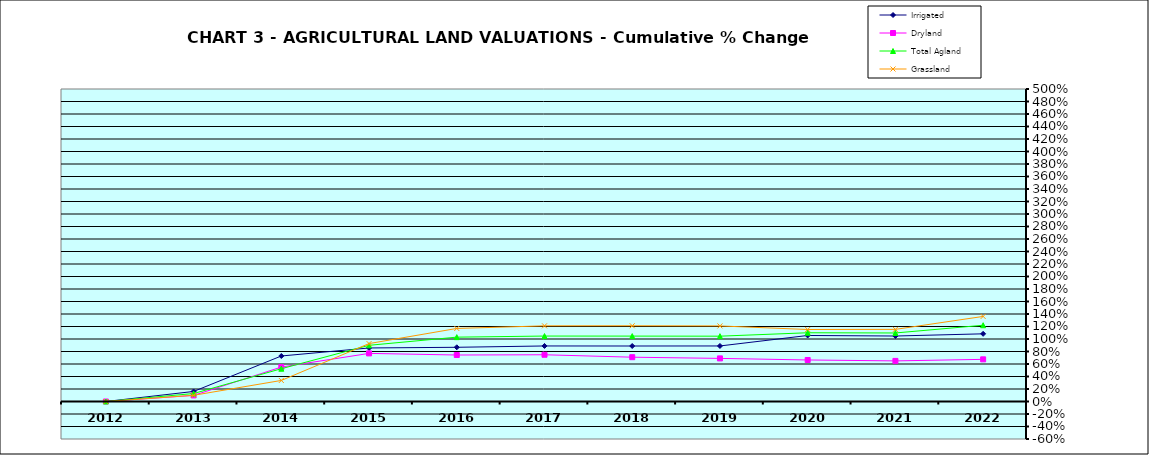
| Category | Irrigated | Dryland | Total Agland | Grassland |
|---|---|---|---|---|
| 2012.0 | 0 | 0 | 0 | 0 |
| 2013.0 | 0.161 | 0.098 | 0.128 | 0.099 |
| 2014.0 | 0.728 | 0.551 | 0.524 | 0.337 |
| 2015.0 | 0.857 | 0.77 | 0.899 | 0.927 |
| 2016.0 | 0.867 | 0.744 | 1.03 | 1.169 |
| 2017.0 | 0.889 | 0.748 | 1.047 | 1.211 |
| 2018.0 | 0.888 | 0.709 | 1.046 | 1.212 |
| 2019.0 | 0.889 | 0.69 | 1.045 | 1.209 |
| 2020.0 | 1.056 | 0.664 | 1.1 | 1.152 |
| 2021.0 | 1.048 | 0.65 | 1.096 | 1.154 |
| 2022.0 | 1.083 | 0.674 | 1.22 | 1.361 |